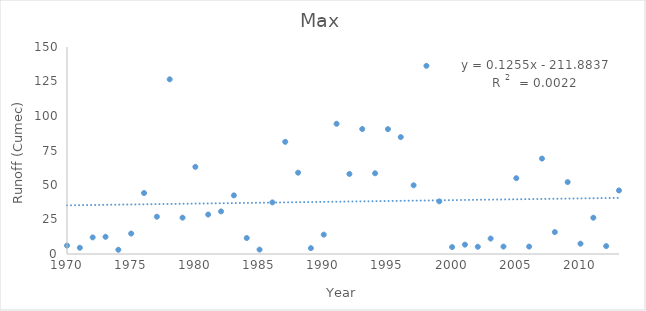
| Category | Max |
|---|---|
| 1970.0 | 6.089 |
| 1971.0 | 4.531 |
| 1972.0 | 12.036 |
| 1973.0 | 12.461 |
| 1974.0 | 3.087 |
| 1975.0 | 14.812 |
| 1976.0 | 44.18 |
| 1977.0 | 27.018 |
| 1978.0 | 126.593 |
| 1979.0 | 26.338 |
| 1980.0 | 63.155 |
| 1981.0 | 28.604 |
| 1982.0 | 30.869 |
| 1983.0 | 42.481 |
| 1984.0 | 11.583 |
| 1985.0 | 3.2 |
| 1986.0 | 37.383 |
| 1987.0 | 81.28 |
| 1988.0 | 58.907 |
| 1989.0 | 4.24 |
| 1990.0 | 14.03 |
| 1991.0 | 94.369 |
| 1992.0 | 58.01 |
| 1993.0 | 90.56 |
| 1994.0 | 58.494 |
| 1995.0 | 90.48 |
| 1996.0 | 84.71 |
| 1997.0 | 49.784 |
| 1998.0 | 136.367 |
| 1999.0 | 38.146 |
| 2000.0 | 5.014 |
| 2001.0 | 6.777 |
| 2002.0 | 5.241 |
| 2003.0 | 11.2 |
| 2004.0 | 5.392 |
| 2005.0 | 54.94 |
| 2006.0 | 5.379 |
| 2007.0 | 69.14 |
| 2008.0 | 15.89 |
| 2009.0 | 52.11 |
| 2010.0 | 7.477 |
| 2011.0 | 26.29 |
| 2012.0 | 5.736 |
| 2013.0 | 46.04 |